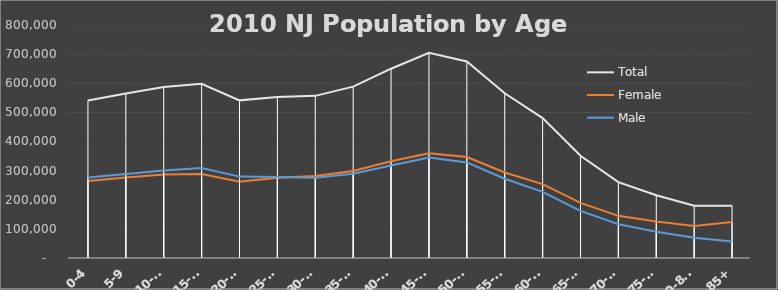
| Category | Total | Female | Male |
|---|---|---|---|
|  0-4 | 541020 | 264751 | 276269 |
|  5-9 | 564750 | 276129 | 288621 |
|  10-14 | 587335 | 287019 | 300316 |
|  15-19 | 598099 | 288755 | 309344 |
|  20-24 | 541238 | 261808 | 279430 |
|  25-29 | 553139 | 275364 | 277775 |
|  30-34 | 556662 | 281296 | 275366 |
|  35-39 | 588379 | 298981 | 289398 |
|  40-44 | 649918 | 332215 | 317703 |
|  45-49 | 704516 | 359903 | 344613 |
|  50-54 | 674680 | 346545 | 328135 |
|  55-59 | 565623 | 293437 | 272186 |
|  60-64 | 480542 | 253532 | 227010 |
|  65-69 | 350972 | 189368 | 161604 |
|  70-74 | 260462 | 144796 | 115666 |
|  75-79 | 215715 | 125417 | 90298 |
|  80-84  | 179233 | 109704 | 69529 |
|  85+ | 179611 | 123274 | 56337 |